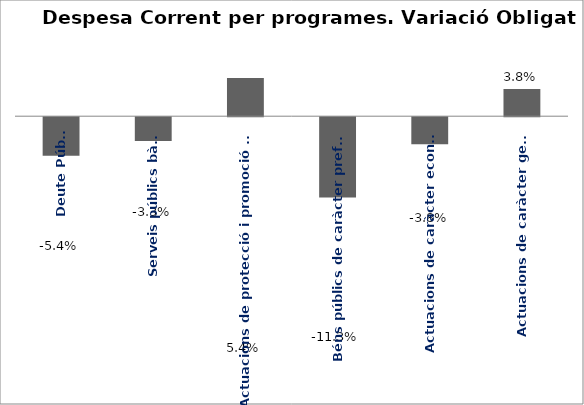
| Category | Series 0 |
|---|---|
| Deute Públic | -0.054 |
| Serveis públics bàsics | -0.033 |
| Actuacions de protecció i promoció social | 0.054 |
| Béns públics de caràcter preferent | -0.113 |
| Actuacions de caràcter econòmic | -0.038 |
| Actuacions de caràcter general | 0.038 |